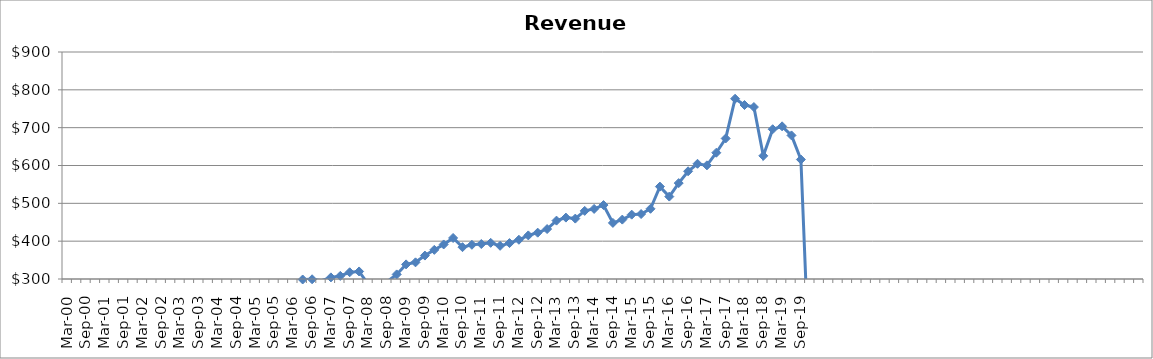
| Category | Revenue ($Millions) |
|---|---|
| Mar-00 | 288.68 |
| Jun-00 | 267.47 |
| Sep-00 | 237.106 |
| Dec-00 | 186.114 |
| Mar-01 | 201.256 |
| Jun-01 | 195.887 |
| Sep-01 | 196.517 |
| Dec-01 | 203.684 |
| Mar-02 | 203.05 |
| Jun-02 | 199.756 |
| Sep-02 | 211.475 |
| Dec-02 | 229.228 |
| Mar-03 | 240.572 |
| Jun-03 | 257.551 |
| Sep-03 | 250.549 |
| Dec-03 | 252.581 |
| Mar-04 | 256.35 |
| Jun-04 | 268.728 |
| Sep-04 | 256.558 |
| Dec-04 | 262.416 |
| Mar-05 | 269.394 |
| Jun-05 | 271.383 |
| Sep-05 | 277.746 |
| Dec-05 | 286.264 |
| Mar-06 | 292.519 |
| Jun-06 | 298.702 |
| Sep-06 | 299.296 |
| Dec-06 | 295.743 |
| Mar-07 | 304.273 |
| Jun-07 | 308.24 |
| Sep-07 | 317.787 |
| Dec-07 | 319.927 |
| Mar-08 | 285.254 |
| Jun-08 | 295.908 |
| Sep-08 | 293.368 |
| Dec-08 | 312.134 |
| Mar-09 | 338.637 |
| Jun-09 | 344.057 |
| Sep-09 | 361.919 |
| Dec-09 | 377 |
| Mar-10 | 391.278 |
| Jun-10 | 408.471 |
| Sep-10 | 384.109 |
| Dec-10 | 390.406 |
| Mar-11 | 392.467 |
| Jun-11 | 395.588 |
| Sep-11 | 387.695 |
| Dec-11 | 394.922 |
| Mar-12 | 403.733 |
| Jun-12 | 415.244 |
| Sep-12 | 422.413 |
| Dec-12 | 432.028 |
| Mar-13 | 454.328 |
| Jun-13 | 462.306 |
| Sep-13 | 459.658 |
| Dec-13 | 479.993 |
| Mar-14 | 485.251 |
| Jun-14 | 495.428 |
| Sep-14 | 448.268 |
| Dec-14 | 457.003 |
| Mar-15 | 470.056 |
| Jun-15 | 471.695 |
| Sep-15 | 485.598 |
| Dec-15 | 544.205 |
| Mar-16 | 517.822 |
| Jun-16 | 553.471 |
| Sep-16 | 584.747 |
| Dec-16 | 604.557 |
| Mar-17 | 600.38 |
| Jun-17 | 633.765 |
| Sep-17 | 671.456 |
| Dec-17 | 776.456 |
| Mar-18 | 759.884 |
| Jun-18 | 754.511 |
| Sep-18 | 625.535 |
| Dec-18 | 695.865 |
| Mar-19 | 703.516 |
| Jun-19 | 679.506 |
| Sep-19 | 615.794 |